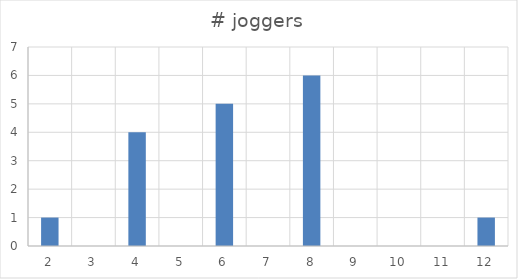
| Category | # joggers |
|---|---|
| 2.0 | 1 |
| 3.0 | 0 |
| 4.0 | 4 |
| 5.0 | 0 |
| 6.0 | 5 |
| 7.0 | 0 |
| 8.0 | 6 |
| 9.0 | 0 |
| 10.0 | 0 |
| 11.0 | 0 |
| 12.0 | 1 |